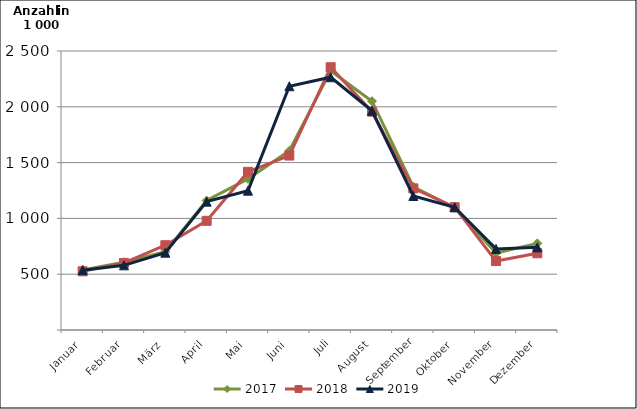
| Category | 2017 | 2018 | 2019 |
|---|---|---|---|
| Januar | 538.58 | 526.008 | 535.963 |
| Februar | 606.549 | 601.214 | 579.498 |
| März | 701.814 | 759.707 | 692.919 |
| April | 1160.421 | 978.366 | 1150.261 |
| Mai | 1353.809 | 1417.288 | 1248.55 |
| Juni | 1605.779 | 1562.95 | 2184.369 |
| Juli | 2323.024 | 2354.818 | 2265.057 |
| August | 2050.191 | 1956.322 | 1964.706 |
| September | 1283.906 | 1269.282 | 1200.938 |
| Oktober | 1095.592 | 1100.383 | 1099.907 |
| November | 689.883 | 617.521 | 726.766 |
| Dezember | 776.478 | 687.698 | 740.391 |